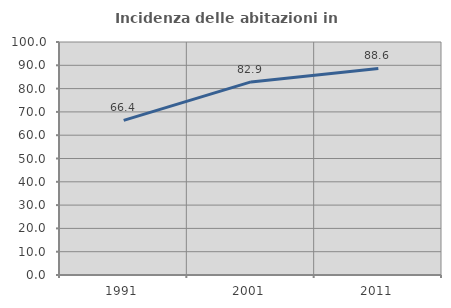
| Category | Incidenza delle abitazioni in proprietà  |
|---|---|
| 1991.0 | 66.372 |
| 2001.0 | 82.873 |
| 2011.0 | 88.636 |